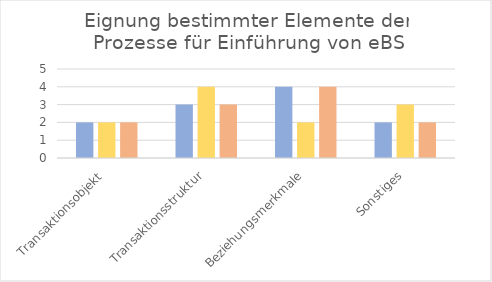
| Category | Series 0 | Series 1 | Series 2 |
|---|---|---|---|
| Transaktionsobjekt | 2 | 2 | 2 |
| Transaktionsstruktur | 3 | 4 | 3 |
| Beziehungsmerkmale | 4 | 2 | 4 |
| Sonstiges | 2 | 3 | 2 |